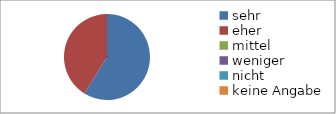
| Category | Series 0 |
|---|---|
| sehr | 10 |
| eher | 7 |
| mittel | 0 |
| weniger | 0 |
| nicht | 0 |
| keine Angabe | 0 |